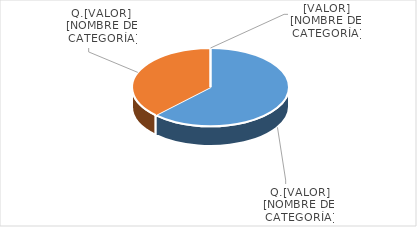
| Category | Series 0 |
|---|---|
| PRESUPUESTO VIGENTE PARA 2023 | 19000000 |
| PRESUPUESTO EJECUTADO  | 11500706.37 |
| PORCENTAJE DE EJECUCIÓN  | 0.605 |